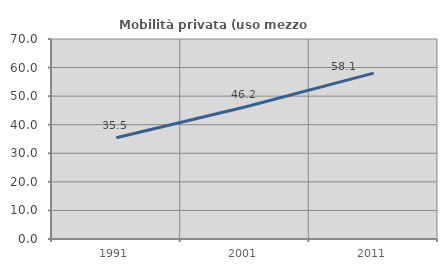
| Category | Mobilità privata (uso mezzo privato) |
|---|---|
| 1991.0 | 35.451 |
| 2001.0 | 46.212 |
| 2011.0 | 58.072 |